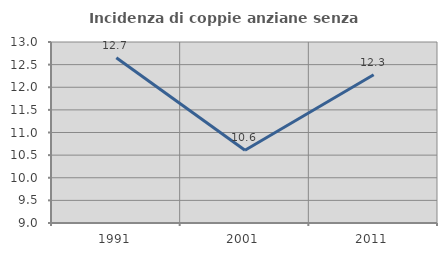
| Category | Incidenza di coppie anziane senza figli  |
|---|---|
| 1991.0 | 12.651 |
| 2001.0 | 10.606 |
| 2011.0 | 12.275 |